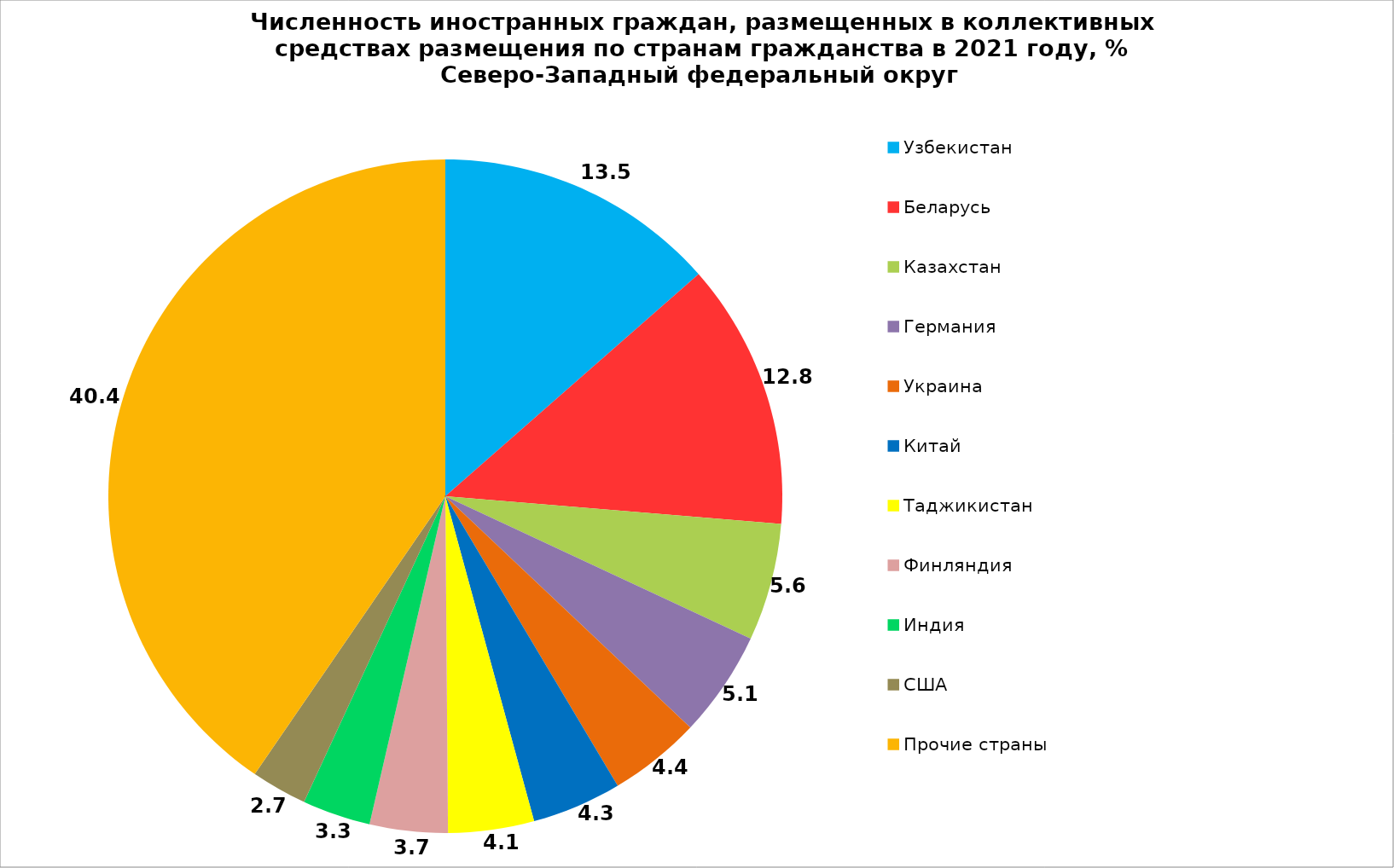
| Category | Series 0 |
|---|---|
| Узбекистан | 13.535 |
| Беларусь | 12.78 |
| Казахстан | 5.637 |
| Германия | 5.093 |
| Украина | 4.41 |
| Китай | 4.302 |
| Таджикистан | 4.118 |
| Финляндия | 3.74 |
| Индия | 3.272 |
| США | 2.679 |
| Прочие страны | 40.435 |